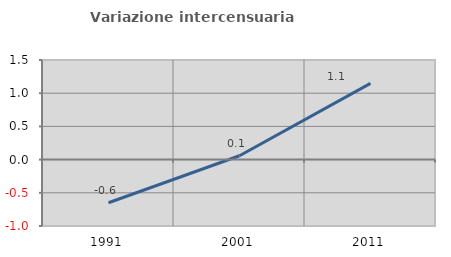
| Category | Variazione intercensuaria annua |
|---|---|
| 1991.0 | -0.65 |
| 2001.0 | 0.058 |
| 2011.0 | 1.147 |